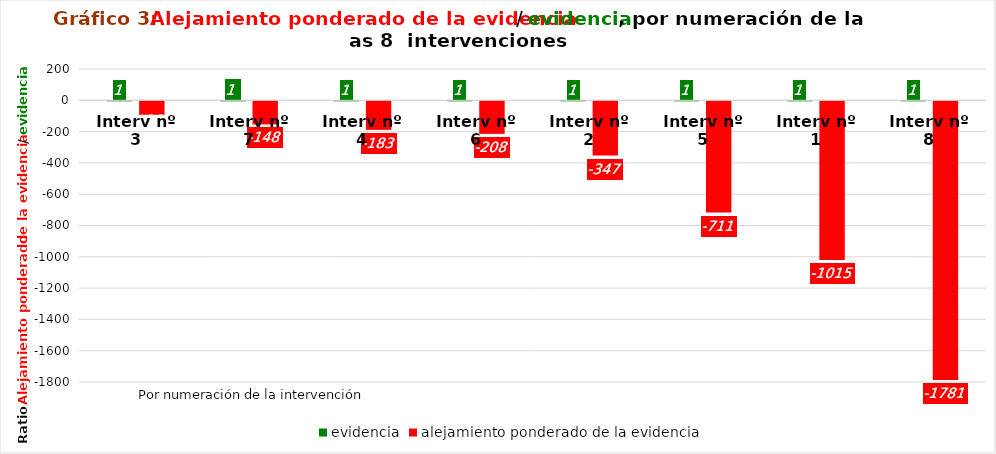
| Category | evidencia | alejamiento ponderado de la evidencia |
|---|---|---|
| Interv nº 3 | 1 | -86.044 |
| Interv nº 7 | 1 | -148.064 |
| Interv nº 4 | 1 | -182.53 |
| Interv nº 6 | 1 | -207.98 |
| Interv nº 2 | 1 | -346.525 |
| Interv nº 5 | 1 | -711.105 |
| Interv nº 1 | 1 | -1014.844 |
| Interv nº 8 | 1 | -1781.208 |